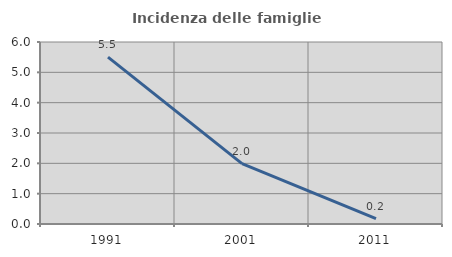
| Category | Incidenza delle famiglie numerose |
|---|---|
| 1991.0 | 5.501 |
| 2001.0 | 1.993 |
| 2011.0 | 0.176 |